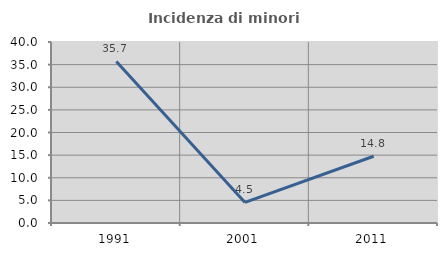
| Category | Incidenza di minori stranieri |
|---|---|
| 1991.0 | 35.714 |
| 2001.0 | 4.545 |
| 2011.0 | 14.754 |